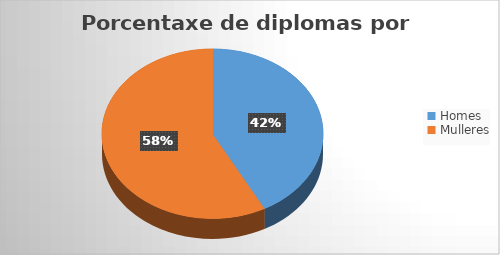
| Category | Series 0 |
|---|---|
| Homes | 198 |
| Mulleres | 271 |